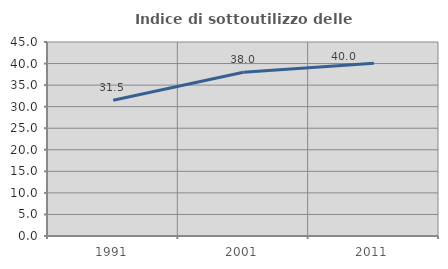
| Category | Indice di sottoutilizzo delle abitazioni  |
|---|---|
| 1991.0 | 31.487 |
| 2001.0 | 37.975 |
| 2011.0 | 40.048 |